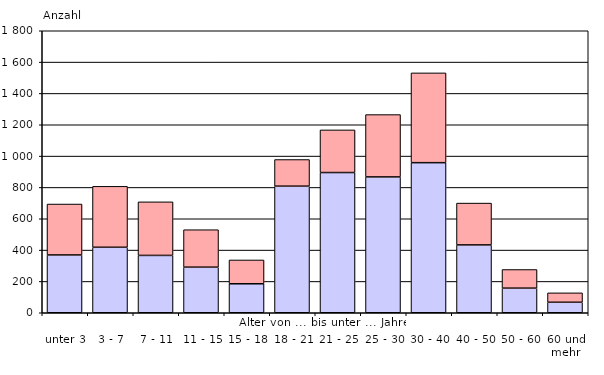
| Category | männlich | weiblich |
|---|---|---|
| 
unter 3 | 369 | 325 |
| 
3 - 7 | 418 | 389 |
| 
7 - 11 | 366 | 342 |
| 
11 - 15 | 291 | 239 |
| 
15 - 18 | 185 | 152 |
| 
18 - 21 | 808 | 170 |
| 
21 - 25 | 895 | 272 |
| 
25 - 30 | 867 | 398 |
| 
30 - 40 | 958 | 573 |
| 
40 - 50 | 433 | 267 |
| 
50 - 60 | 157 | 119 |
| 
60 und mehr | 67 | 60 |